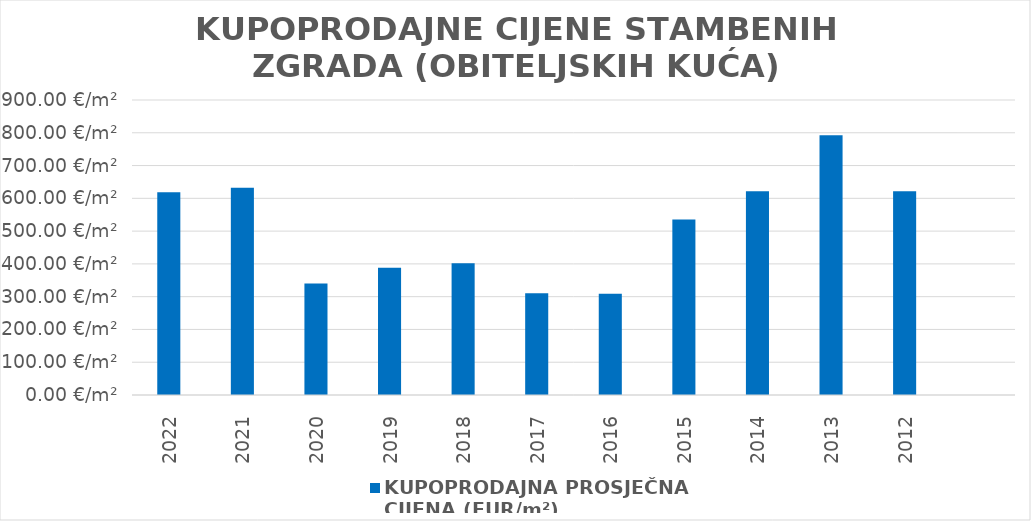
| Category | KUPOPRODAJNA PROSJEČNA 
CIJENA (EUR/m²) |
|---|---|
| 2022 | 1901-09-09 09:31:28 |
| 2021 | 1901-09-23 09:31:23 |
| 2020 | 1900-12-04 21:31:20 |
| 2019 | 1901-01-21 22:11:48 |
| 2018 | 1901-02-04 20:21:24 |
| 2017 | 1900-11-05 09:48:36 |
| 2016 | 1900-11-03 19:40:53 |
| 2015 | 1901-06-18 08:48:54 |
| 2014 | 1901-09-12 15:43:36 |
| 2013 | 1902-03-02 10:01:21 |
| 2012 | 1901-09-12 10:55:18 |